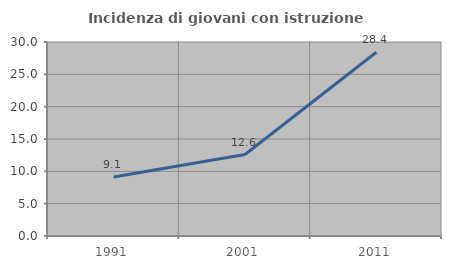
| Category | Incidenza di giovani con istruzione universitaria |
|---|---|
| 1991.0 | 9.135 |
| 2001.0 | 12.595 |
| 2011.0 | 28.409 |